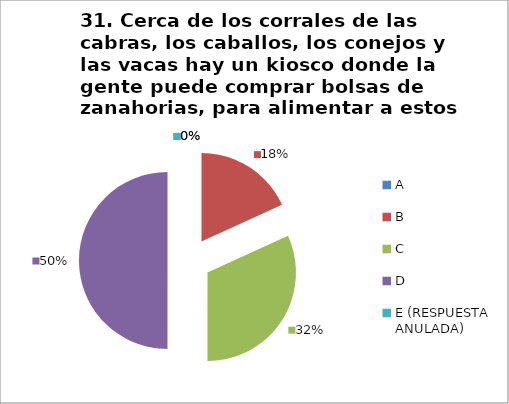
| Category | CANTIDAD DE RESPUESTAS PREGUNTA (31) | PORCENTAJE |
|---|---|---|
| A | 0 | 0 |
| B | 4 | 0.182 |
| C | 7 | 0.318 |
| D | 11 | 0.5 |
| E (RESPUESTA ANULADA) | 0 | 0 |